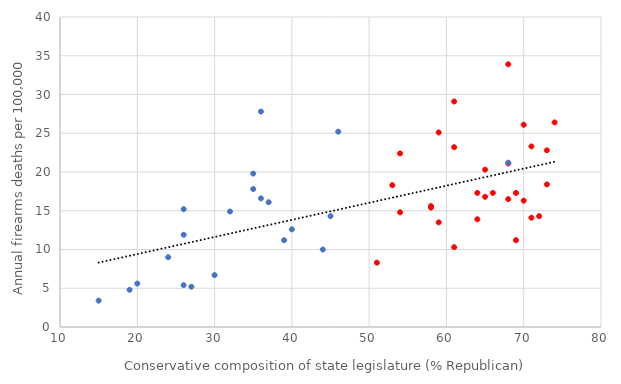
| Category | Deah rate per 100,000 in 2021 |
|---|---|
| 74.0 | 26.4 |
| 46.0 | 25.2 |
| 53.0 | 18.3 |
| 71.0 | 23.3 |
| 24.0 | 9 |
| 35.0 | 17.8 |
| 30.0 | 6.7 |
| 36.0 | 16.6 |
| 71.0 | 14.1 |
| 65.0 | 20.3 |
| 19.0 | 4.8 |
| 70.0 | 16.3 |
| 37.0 | 16.1 |
| 73.0 | 18.4 |
| 69.0 | 11.2 |
| 64.0 | 17.3 |
| 68.0 | 21.1 |
| 61.0 | 29.1 |
| 40.0 | 12.6 |
| 26.0 | 15.2 |
| 15.0 | 3.4 |
| 58.0 | 15.4 |
| 44.0 | 10 |
| 68.0 | 33.9 |
| 61.0 | 23.2 |
| 59.0 | 25.1 |
| 61.0 | 10.3 |
| 35.0 | 19.8 |
| 51.0 | 8.3 |
| 27.0 | 5.2 |
| 36.0 | 27.8 |
| 26.0 | 5.4 |
| 66.0 | 17.3 |
| 65.0 | 16.8 |
| 68.0 | 16.5 |
| 68.0 | 21.2 |
| 32.0 | 14.9 |
| 54.0 | 14.8 |
| 20.0 | 5.6 |
| 54.0 | 22.4 |
| 72.0 | 14.3 |
| 73.0 | 22.8 |
| 58.0 | 15.6 |
| 64.0 | 13.9 |
| 26.0 | 11.9 |
| 45.0 | 14.3 |
| 39.0 | 11.2 |
| 69.0 | 17.3 |
| 59.0 | 13.5 |
| 70.0 | 26.1 |